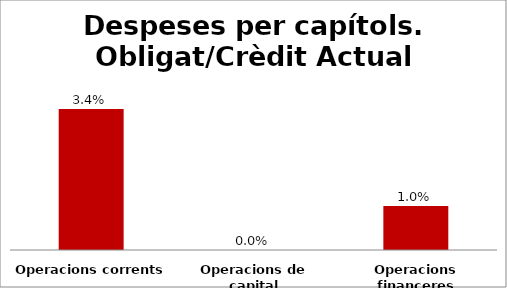
| Category | Series 0 |
|---|---|
| Operacions corrents | 0.034 |
| Operacions de capital | 0 |
| Operacions financeres | 0.01 |